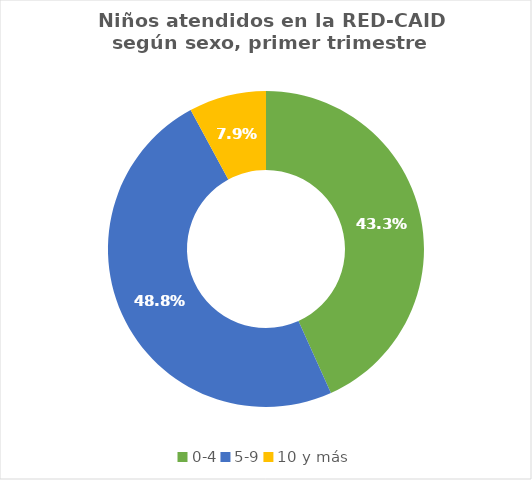
| Category | Series 0 |
|---|---|
| 0-4 | 979 |
| 5-9 | 1105 |
| 10 y más | 179 |